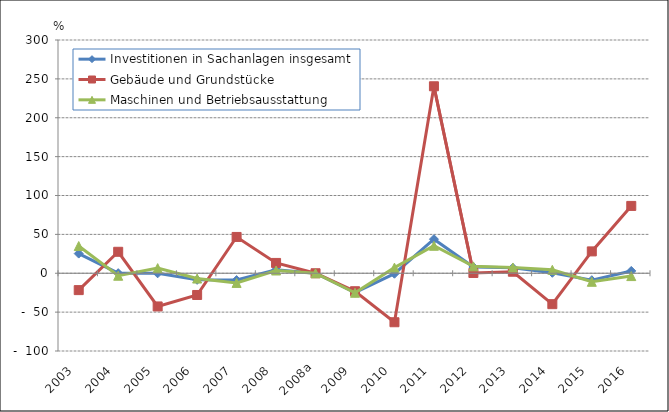
| Category | Investitionen in Sachanlagen insgesamt | Gebäude und Grundstücke | Maschinen und Betriebsausstattung |
|---|---|---|---|
| 2003  | 25.3 | -21.7 | 35 |
| 2004  | 0.1 | 27.6 | -3.2 |
| 2005  | -0.1 | -42.7 | 6.6 |
| 2006  | -8.473 | -27.938 | -6.81 |
| 2007  | -8.766 | 46.686 | -12.43 |
| 2008  | 4.511 | 13.27 | 3.542 |
| 2008a | 0 | 0 | 0 |
| 2009  | -24.896 | -23.131 | -25.113 |
| 2010  | -0.603 | -63.012 | 7.236 |
| 2011  | 43.839 | 240.486 | 35.319 |
| 2012  | 8.013 | 0.373 | 8.846 |
| 2013  | 6.929 | 1.955 | 7.43 |
| 2014  | 0.591 | -39.758 | 4.441 |
| 2015  | -8.949 | 28.111 | -10.989 |
| 2016  | 2.982 | 86.615 | -3.643 |